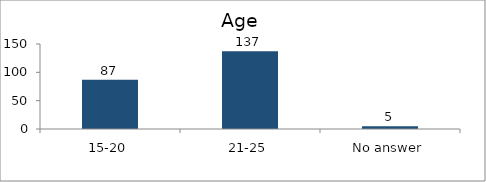
| Category | Age |
|---|---|
| 15-20 | 87 |
| 21-25 | 137 |
| No answer | 5 |